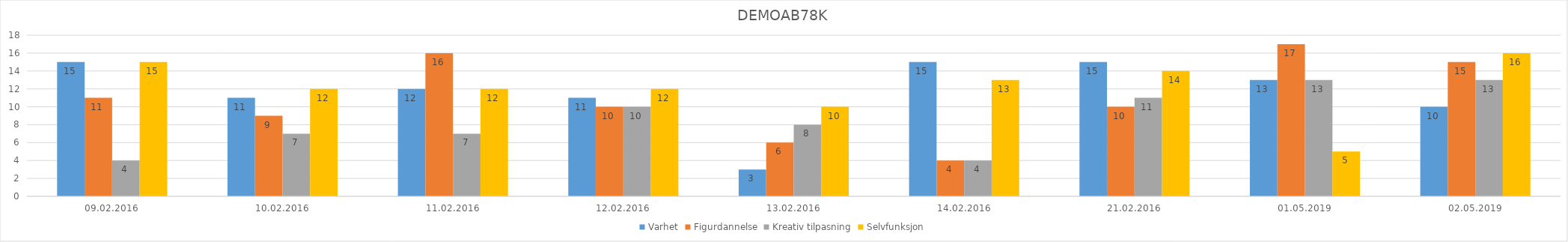
| Category | Varhet | Figurdannelse | Kreativ tilpasning | Selvfunksjon |
|---|---|---|---|---|
| 09.02.2016 | 15 | 11 | 4 | 15 |
| 10.02.2016 | 11 | 9 | 7 | 12 |
| 11.02.2016 | 12 | 16 | 7 | 12 |
| 12.02.2016 | 11 | 10 | 10 | 12 |
| 13.02.2016 | 3 | 6 | 8 | 10 |
| 14.02.2016 | 15 | 4 | 4 | 13 |
| 21.02.2016 | 15 | 10 | 11 | 14 |
| 01.05.2019 | 13 | 17 | 13 | 5 |
| 02.05.2019 | 10 | 15 | 13 | 16 |